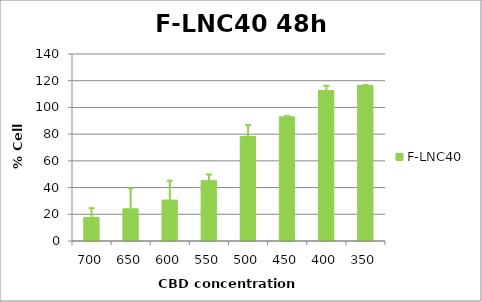
| Category | F-LNC40 |
|---|---|
| 700.0 | 17.574 |
| 650.0 | 24.097 |
| 600.0 | 30.632 |
| 550.0 | 45.201 |
| 500.0 | 78.278 |
| 450.0 | 92.938 |
| 400.0 | 112.694 |
| 350.0 | 116.521 |